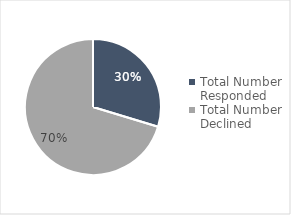
| Category | Series 0 |
|---|---|
| Total Number Responded | 49 |
| Total Number Declined | 116 |